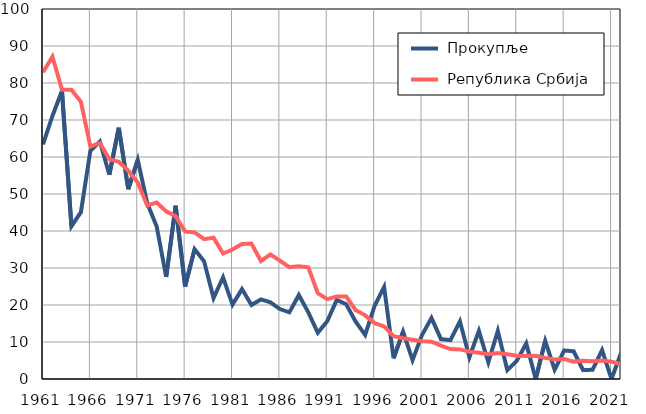
| Category |  Прокупље |  Република Србија |
|---|---|---|
| 1961.0 | 63.4 | 82.9 |
| 1962.0 | 71.1 | 87.1 |
| 1963.0 | 77.9 | 78.2 |
| 1964.0 | 41.3 | 78.2 |
| 1965.0 | 45.1 | 74.9 |
| 1966.0 | 61.7 | 62.8 |
| 1967.0 | 64.2 | 63.8 |
| 1968.0 | 55.2 | 59.4 |
| 1969.0 | 67.9 | 58.7 |
| 1970.0 | 51.3 | 56.3 |
| 1971.0 | 59.2 | 53.1 |
| 1972.0 | 47.5 | 46.9 |
| 1973.0 | 41.2 | 47.7 |
| 1974.0 | 27.6 | 45.3 |
| 1975.0 | 46.8 | 44 |
| 1976.0 | 25 | 39.9 |
| 1977.0 | 35.1 | 39.6 |
| 1978.0 | 31.8 | 37.8 |
| 1979.0 | 21.9 | 38.2 |
| 1980.0 | 27.5 | 33.9 |
| 1981.0 | 20.1 | 35 |
| 1982.0 | 24.3 | 36.5 |
| 1983.0 | 20 | 36.6 |
| 1984.0 | 21.5 | 31.9 |
| 1985.0 | 20.7 | 33.7 |
| 1986.0 | 18.9 | 32 |
| 1987.0 | 18 | 30.2 |
| 1988.0 | 22.7 | 30.5 |
| 1989.0 | 18 | 30.2 |
| 1990.0 | 12.5 | 23.2 |
| 1991.0 | 15.6 | 21.6 |
| 1992.0 | 21.4 | 22.3 |
| 1993.0 | 20.2 | 22.3 |
| 1994.0 | 15.5 | 18.6 |
| 1995.0 | 11.9 | 17.2 |
| 1996.0 | 19.8 | 15.1 |
| 1997.0 | 24.9 | 14.2 |
| 1998.0 | 5.6 | 11.6 |
| 1999.0 | 12.8 | 11 |
| 2000.0 | 5.1 | 10.6 |
| 2001.0 | 11.9 | 10.2 |
| 2002.0 | 16.5 | 10.1 |
| 2003.0 | 10.8 | 9 |
| 2004.0 | 10.5 | 8.1 |
| 2005.0 | 15.6 | 8 |
| 2006.0 | 5.9 | 7.4 |
| 2007.0 | 13 | 7.1 |
| 2008.0 | 4.5 | 6.7 |
| 2009.0 | 13 | 7 |
| 2010.0 | 2.4 | 6.7 |
| 2011.0 | 4.9 | 6.3 |
| 2012.0 | 9.6 | 6.2 |
| 2013.0 | 0 | 6.3 |
| 2014.0 | 10.3 | 5.7 |
| 2015.0 | 2.5 | 5.3 |
| 2016.0 | 7.7 | 5.4 |
| 2017.0 | 7.5 | 4.7 |
| 2018.0 | 2.4 | 4.9 |
| 2019.0 | 2.5 | 4.8 |
| 2020.0 | 7.8 | 5 |
| 2021.0 | 0 | 4.7 |
| 2022.0 | 7 | 4 |